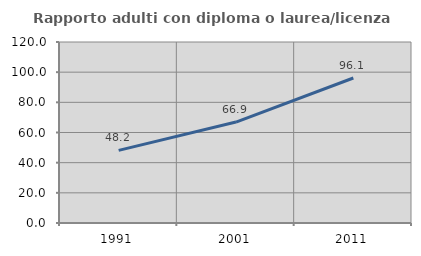
| Category | Rapporto adulti con diploma o laurea/licenza media  |
|---|---|
| 1991.0 | 48.168 |
| 2001.0 | 66.929 |
| 2011.0 | 96.127 |